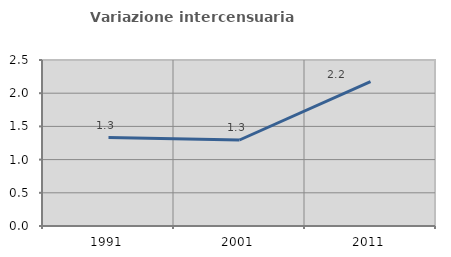
| Category | Variazione intercensuaria annua |
|---|---|
| 1991.0 | 1.332 |
| 2001.0 | 1.295 |
| 2011.0 | 2.175 |